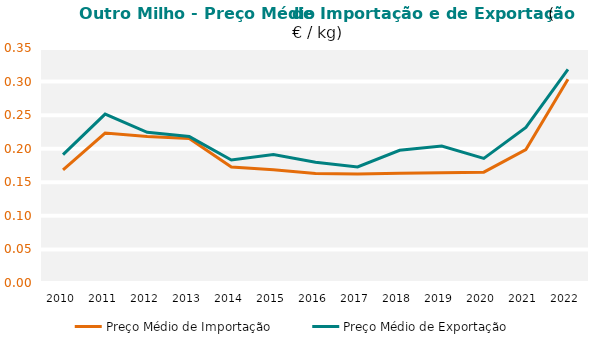
| Category | Preço Médio de Importação | Preço Médio de Exportação |
|---|---|---|
| 2010.0 | 0.169 | 0.191 |
| 2011.0 | 0.223 | 0.251 |
| 2012.0 | 0.218 | 0.224 |
| 2013.0 | 0.215 | 0.218 |
| 2014.0 | 0.173 | 0.183 |
| 2015.0 | 0.169 | 0.191 |
| 2016.0 | 0.163 | 0.18 |
| 2017.0 | 0.162 | 0.173 |
| 2018.0 | 0.163 | 0.198 |
| 2019.0 | 0.164 | 0.204 |
| 2020.0 | 0.165 | 0.186 |
| 2021.0 | 0.199 | 0.232 |
| 2022.0 | 0.303 | 0.318 |